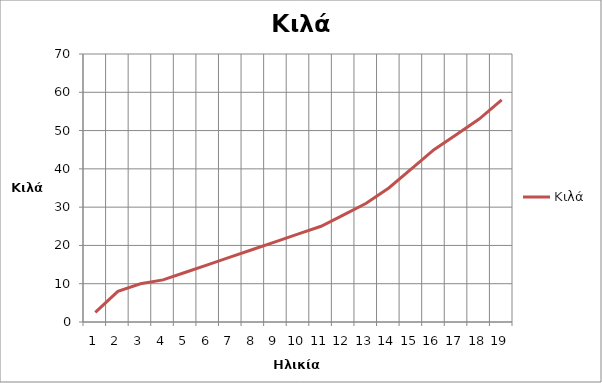
| Category | Κιλά |
|---|---|
| 0 | 2.5 |
| 1 | 8 |
| 2 | 10 |
| 3 | 11 |
| 4 | 13 |
| 5 | 15 |
| 6 | 17 |
| 7 | 19 |
| 8 | 21 |
| 9 | 23 |
| 10 | 25 |
| 11 | 28 |
| 12 | 31 |
| 13 | 35 |
| 14 | 40 |
| 15 | 45 |
| 16 | 49 |
| 17 | 53 |
| 18 | 58 |